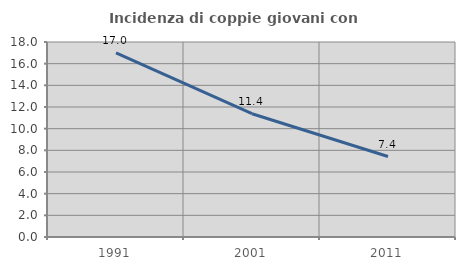
| Category | Incidenza di coppie giovani con figli |
|---|---|
| 1991.0 | 17.007 |
| 2001.0 | 11.381 |
| 2011.0 | 7.426 |